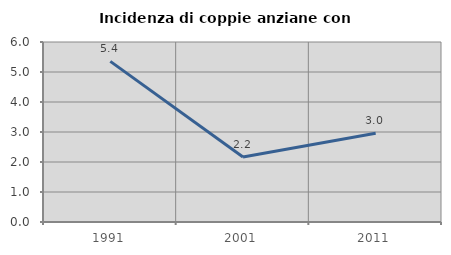
| Category | Incidenza di coppie anziane con figli |
|---|---|
| 1991.0 | 5.355 |
| 2001.0 | 2.169 |
| 2011.0 | 2.959 |